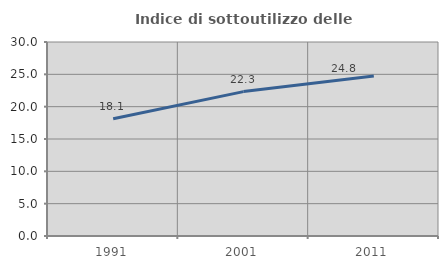
| Category | Indice di sottoutilizzo delle abitazioni  |
|---|---|
| 1991.0 | 18.12 |
| 2001.0 | 22.329 |
| 2011.0 | 24.751 |